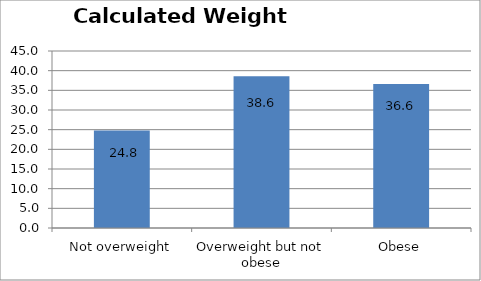
| Category | Series 0 |
|---|---|
| Not overweight | 24.763 |
| Overweight but not obese | 38.603 |
| Obese | 36.634 |